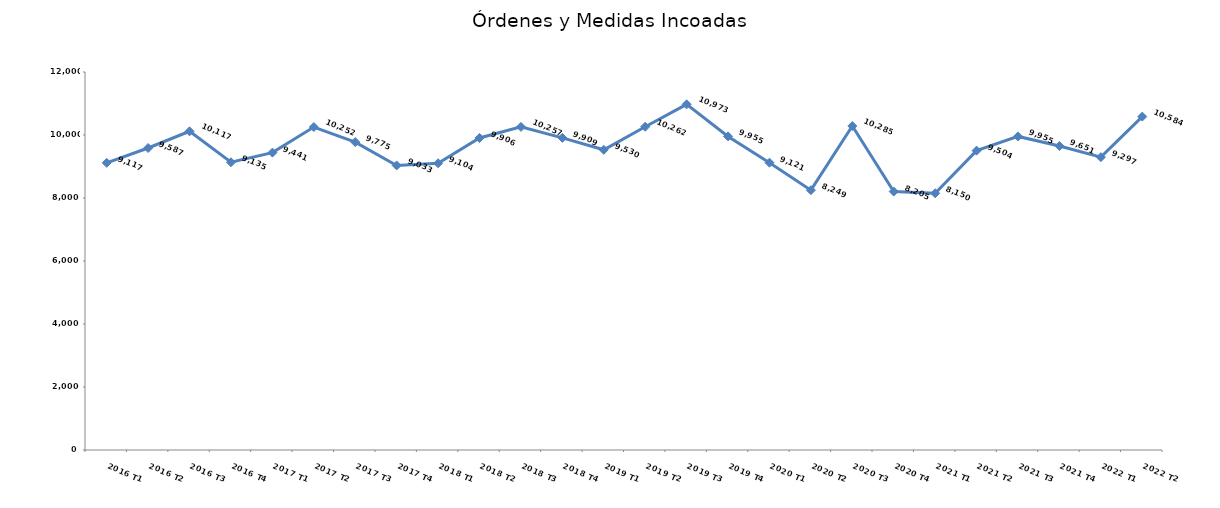
| Category | Órdenes y Medidas incoadas |
|---|---|
| 2016 T1 | 9117 |
| 2016 T2 | 9587 |
| 2016 T3 | 10117 |
| 2016 T4 | 9135 |
| 2017 T1 | 9441 |
| 2017 T2 | 10252 |
| 2017 T3 | 9775 |
| 2017 T4 | 9033 |
| 2018 T1 | 9104 |
| 2018 T2 | 9906 |
| 2018 T3 | 10257 |
| 2018 T4 | 9909 |
| 2019 T1 | 9530 |
| 2019 T2 | 10262 |
| 2019 T3 | 10973 |
| 2019 T4 | 9955 |
| 2020 T1 | 9121 |
| 2020 T2 | 8249 |
| 2020 T3 | 10285 |
| 2020 T4 | 8205 |
| 2021 T1 | 8150 |
| 2021 T2 | 9504 |
| 2021 T3 | 9955 |
| 2021 T4 | 9651 |
| 2022 T1 | 9297 |
| 2022 T2 | 10584 |